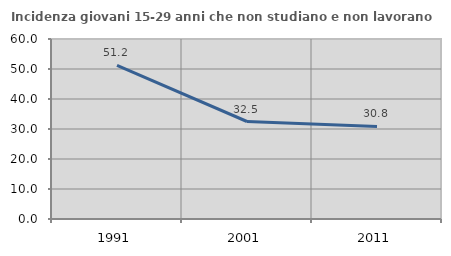
| Category | Incidenza giovani 15-29 anni che non studiano e non lavorano  |
|---|---|
| 1991.0 | 51.221 |
| 2001.0 | 32.5 |
| 2011.0 | 30.844 |